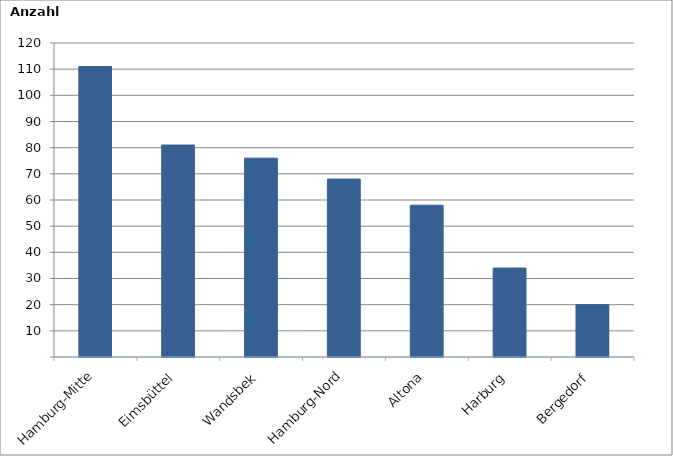
| Category | Series 0 |
|---|---|
| Hamburg-Mitte | 111 |
| Eimsbüttel | 81 |
| Wandsbek | 76 |
| Hamburg-Nord | 68 |
| Altona | 58 |
| Harburg | 34 |
| Bergedorf | 20 |